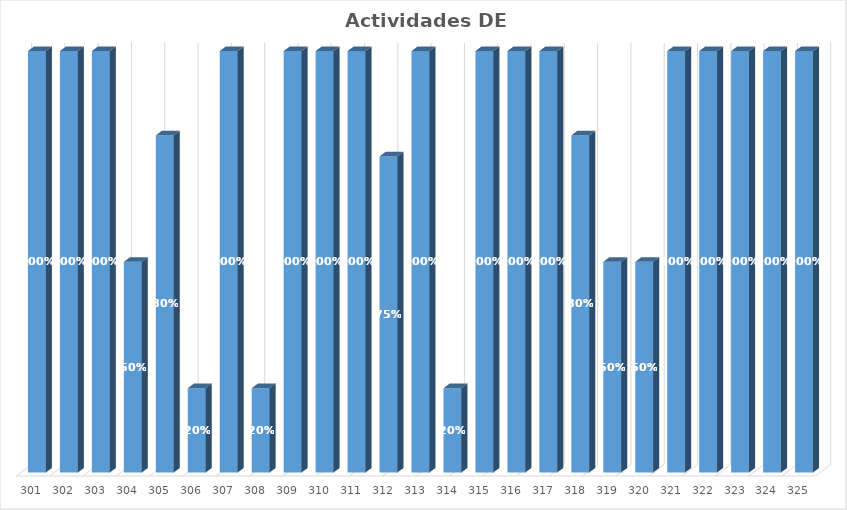
| Category | % Avance |
|---|---|
| 301.0 | 1 |
| 302.0 | 1 |
| 303.0 | 1 |
| 304.0 | 0.5 |
| 305.0 | 0.8 |
| 306.0 | 0.2 |
| 307.0 | 1 |
| 308.0 | 0.2 |
| 309.0 | 1 |
| 310.0 | 1 |
| 311.0 | 1 |
| 312.0 | 0.75 |
| 313.0 | 1 |
| 314.0 | 0.2 |
| 315.0 | 1 |
| 316.0 | 1 |
| 317.0 | 1 |
| 318.0 | 0.8 |
| 319.0 | 0.5 |
| 320.0 | 0.5 |
| 321.0 | 1 |
| 322.0 | 1 |
| 323.0 | 1 |
| 324.0 | 1 |
| 325.0 | 1 |